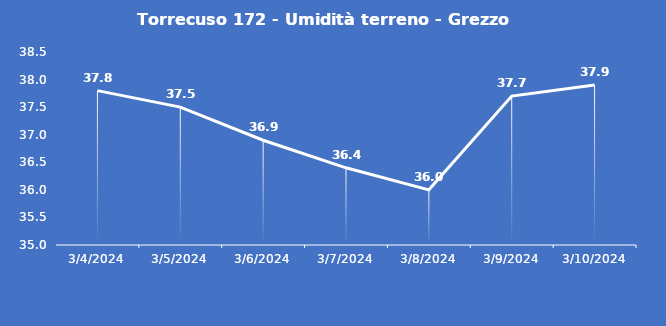
| Category | Torrecuso 172 - Umidità terreno - Grezzo (%VWC) |
|---|---|
| 3/4/24 | 37.8 |
| 3/5/24 | 37.5 |
| 3/6/24 | 36.9 |
| 3/7/24 | 36.4 |
| 3/8/24 | 36 |
| 3/9/24 | 37.7 |
| 3/10/24 | 37.9 |